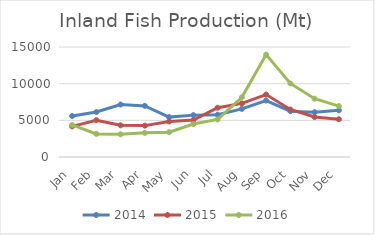
| Category | 2014 | 2015 | 2016 |
|---|---|---|---|
| Jan | 5590 | 4180 | 4370 |
| Feb | 6130 | 5020 | 3150 |
| Mar | 7160 | 4320 | 3090 |
| Apr | 6970 | 4280 | 3290 |
| May | 5440 | 4840 | 3390 |
| Jun | 5710 | 5040 | 4490 |
| Jul | 5760 | 6720 | 5120 |
| Aug | 6560 | 7310 | 8150 |
| Sep | 7700 | 8510 | 13960 |
| Oct | 6250 | 6480 | 10030 |
| Nov | 6110 | 5450 | 7950 |
| Dec | 6370 | 5150 | 6940 |